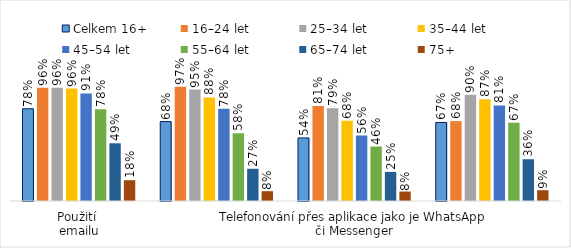
| Category | Celkem 16+ | 16–24 let | 25–34 let | 35–44 let | 45–54 let | 55–64 let | 65–74 let | 75+ |
|---|---|---|---|---|---|---|---|---|
| Použití 
emailu | 0.785 | 0.963 | 0.963 | 0.957 | 0.915 | 0.781 | 0.491 | 0.177 |
| Zásílání zpráv přes aplikace jako je WhatsApp či Messenger | 0.676 | 0.972 | 0.948 | 0.882 | 0.785 | 0.577 | 0.274 | 0.084 |
| Telefonování přes aplikace jako je WhatsApp či Messenger | 0.537 | 0.809 | 0.789 | 0.683 | 0.557 | 0.464 | 0.248 | 0.081 |
| Použití internetového bankovnictví | 0.668 | 0.68 | 0.905 | 0.867 | 0.813 | 0.666 | 0.355 | 0.092 |